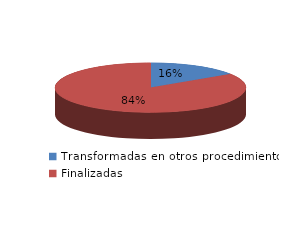
| Category | Series 0 |
|---|---|
| Transformadas en otros procedimientos | 2240 |
| Finalizadas | 12136 |